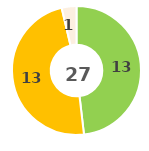
| Category | Series 0 |
|---|---|
| 0 | 0 |
| 1 | 13 |
| 2 | 13 |
| 3 | 0 |
| 4 | 1 |